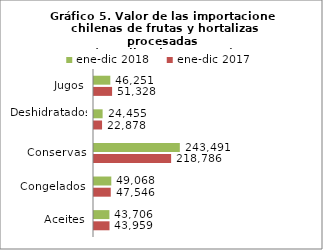
| Category | ene-dic 2017 | ene-dic 2018 |
|---|---|---|
| Aceites | 43959123.69 | 43706121.73 |
| Congelados | 47546132.32 | 49067628.64 |
| Conservas | 218785784.98 | 243490658.07 |
| Deshidratados | 22877741.22 | 24455260.08 |
| Jugos | 51327882.14 | 46251202.7 |